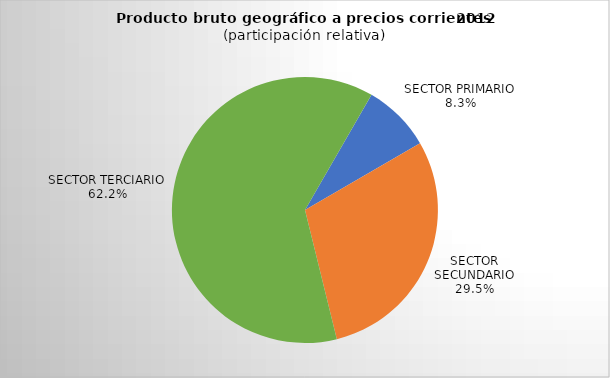
| Category | Series 0 |
|---|---|
| SECTOR PRIMARIO | 1976.912 |
| SECTOR SECUNDARIO | 7033.844 |
| SECTOR TERCIARIO | 14815.308 |